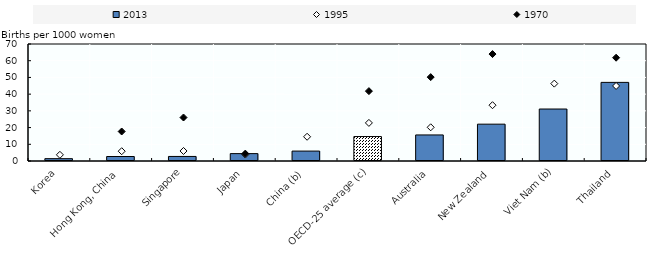
| Category | 2013 |
|---|---|
| Korea | 1.4 |
| Hong Kong, China | 2.692 |
| Singapore | 2.72 |
| Japan | 4.413 |
| China (b) | 5.93 |
| OECD-25 average (c) | 14.632 |
| Australia | 15.593 |
| New Zealand | 22.04 |
| Viet Nam (b) | 31.1 |
| Thailand | 47.032 |